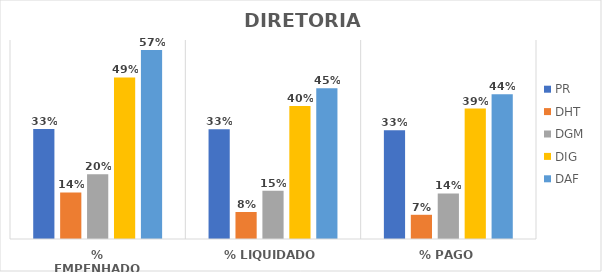
| Category | PR | DHT | DGM | DIG | DAF |
|---|---|---|---|---|---|
| % EMPENHADO | 0.332 | 0.14 | 0.195 | 0.487 | 0.57 |
| % LIQUIDADO | 0.331 | 0.081 | 0.145 | 0.401 | 0.454 |
| % PAGO | 0.328 | 0.073 | 0.137 | 0.393 | 0.436 |